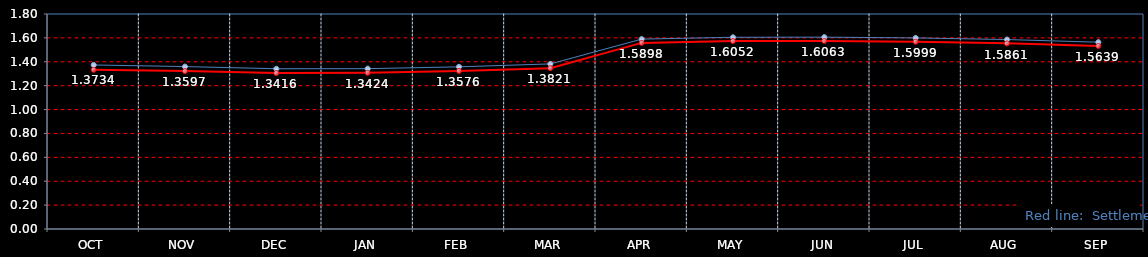
| Category | Last | Settlement |
|---|---|---|
| OCT | 1.373 | 1.333 |
| NOV | 1.36 | 1.322 |
| DEC | 1.342 | 1.306 |
| JAN | 1.342 | 1.308 |
| FEB | 1.358 | 1.323 |
| MAR | 1.382 | 1.347 |
| APR | 1.59 | 1.558 |
| MAY | 1.605 | 1.573 |
| JUN | 1.606 | 1.574 |
| JUL | 1.6 | 1.568 |
| AUG | 1.586 | 1.554 |
| SEP | 1.564 | 1.532 |